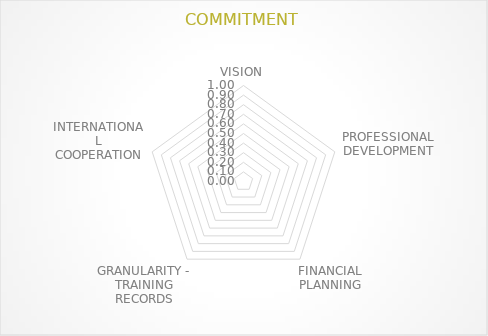
| Category | Series 0 |
|---|---|
| VISION | 0 |
| PROFESSIONAL DEVELOPMENT | 0 |
| FINANCIAL PLANNING | 0 |
| GRANULARITY - TRAINING RECORDS | 0 |
| INTERNATIONAL COOPERATION | 0 |